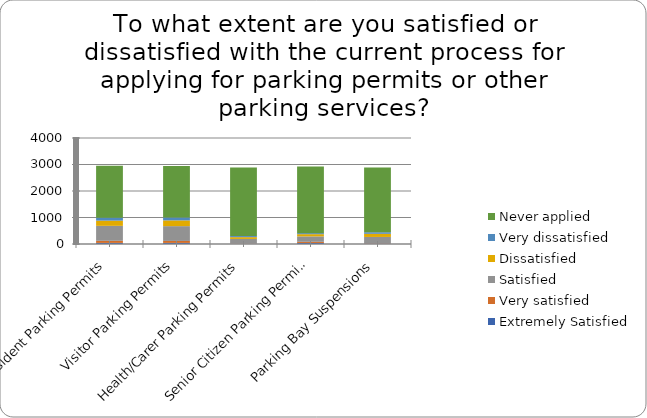
| Category | Extremely Satisfied | Very satisfied | Satisfied | Dissatisfied | Very dissatisfied | Never applied |
|---|---|---|---|---|---|---|
| Resident Parking Permits | 41 | 80 | 564 | 197 | 113 | 1956 |
| Visitor Parking Permits | 41 | 75 | 558 | 217 | 108 | 1944 |
| Health/Carer Parking Permits | 10 | 9 | 172 | 68 | 40 | 2589 |
| Senior Citizen Parking Permits | 39 | 43 | 206 | 83 | 39 | 2516 |
| Parking Bay Suspensions | 16 | 12 | 238 | 119 | 59 | 2445 |